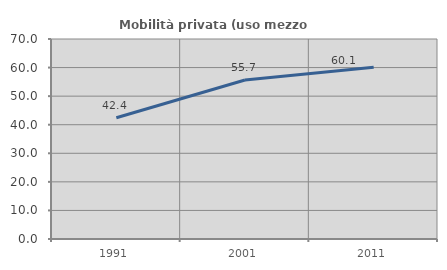
| Category | Mobilità privata (uso mezzo privato) |
|---|---|
| 1991.0 | 42.443 |
| 2001.0 | 55.655 |
| 2011.0 | 60.072 |